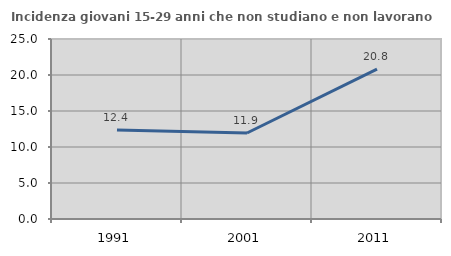
| Category | Incidenza giovani 15-29 anni che non studiano e non lavorano  |
|---|---|
| 1991.0 | 12.364 |
| 2001.0 | 11.943 |
| 2011.0 | 20.819 |